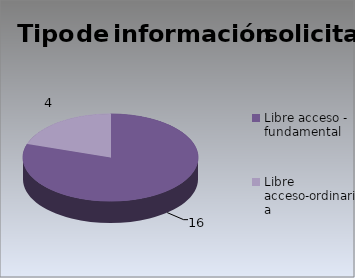
| Category | Series 0 |
|---|---|
| Libre acceso - fundamental | 16 |
| Libre acceso-ordinaria  | 4 |